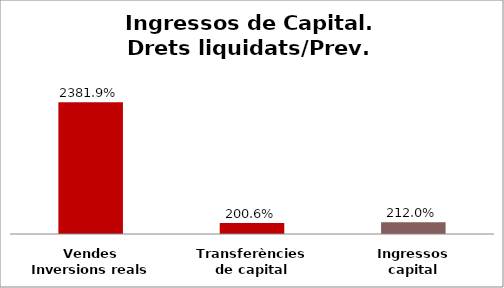
| Category | Series 0 |
|---|---|
| Vendes Inversions reals | 23.819 |
| Transferències de capital | 2.006 |
| Ingressos capital | 2.12 |